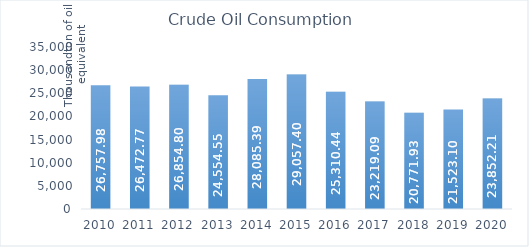
| Category | Crude Oil Consumption |
|---|---|
| 2010.0 | 26757.98 |
| 2011.0 | 26472.77 |
| 2012.0 | 26854.8 |
| 2013.0 | 24554.55 |
| 2014.0 | 28085.39 |
| 2015.0 | 29057.4 |
| 2016.0 | 25310.44 |
| 2017.0 | 23219.09 |
| 2018.0 | 20771.93 |
| 2019.0 | 21523.1 |
| 2020.0 | 23852.21 |